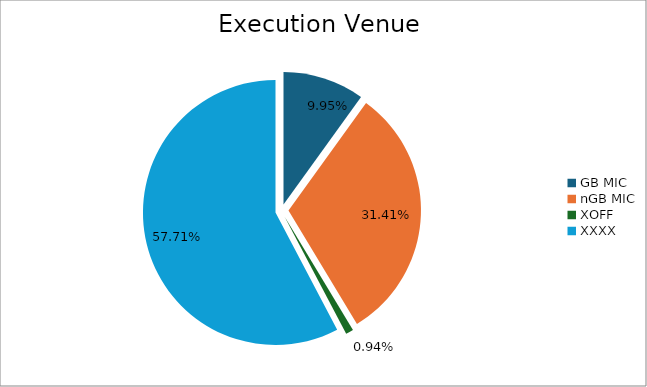
| Category | Series 0 |
|---|---|
| GB MIC | 980657.731 |
| nGB MIC | 3095583.857 |
| XOFF | 92243.102 |
| XXXX | 5687372.76 |